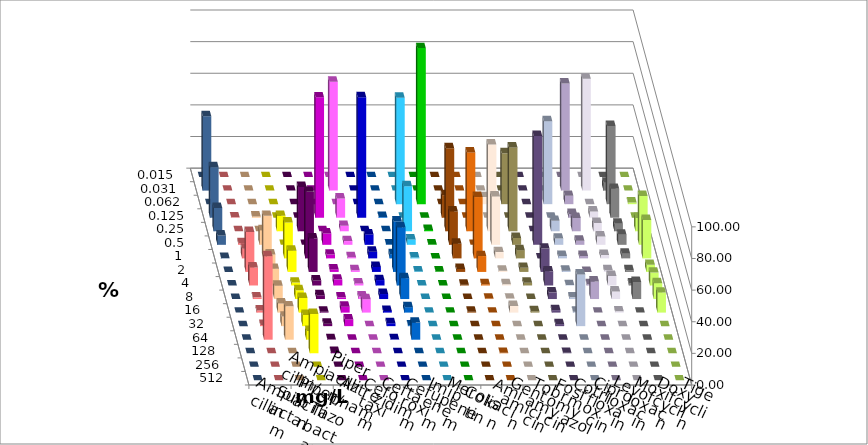
| Category | Ampicillin | Ampicillin/ Sulbactam | Piperacillin | Piperacillin/ Tazobactam | Aztreonam | Cefotaxim | Ceftazidim | Cefuroxim | Imipenem | Meropenem | Colistin | Amikacin | Gentamicin | Tobramycin | Fosfomycin | Cotrimoxazol | Ciprofloxacin | Levofloxacin | Moxifloxacin | Doxycyclin | Tigecyclin |
|---|---|---|---|---|---|---|---|---|---|---|---|---|---|---|---|---|---|---|---|---|---|
| 0.015 | 0 | 0 | 0 | 0 | 0 | 0 | 0 | 0 | 0 | 0 | 0 | 0 | 0 | 0 | 0 | 0 | 0 | 0 | 0 | 0 | 0 |
| 0.031 | 0 | 0 | 0 | 0 | 0 | 68.865 | 0 | 0 | 0 | 0 | 0 | 0 | 0 | 0 | 0 | 0 | 67.81 | 70.712 | 5.026 | 0 | 47.043 |
| 0.062 | 0 | 0 | 0 | 0 | 0 | 0 | 0 | 0 | 67.282 | 98.681 | 0 | 0 | 4.485 | 32.174 | 0 | 52.507 | 5.277 | 0 | 49.471 | 1.055 | 0 |
| 0.125 | 0.264 | 0.792 | 0 | 0 | 76.127 | 12.137 | 76.253 | 0.528 | 0 | 0 | 14.248 | 0 | 0 | 0 | 0 | 0 | 2.375 | 3.958 | 18.254 | 0 | 31.989 |
| 0.25 | 0 | 0 | 9.763 | 28.042 | 0 | 3.43 | 0 | 0 | 28.496 | 0.792 | 52.507 | 49.868 | 54.881 | 53.043 | 0 | 6.596 | 8.443 | 5.277 | 4.762 | 8.443 | 14.785 |
| 0.5 | 1.055 | 9.235 | 0 | 0 | 7.162 | 2.375 | 6.596 | 0.264 | 3.43 | 0.264 | 21.108 | 0 | 30.607 | 4.348 | 68.865 | 3.958 | 2.639 | 5.277 | 6.349 | 30.871 | 5.914 |
| 1.0 | 6.069 | 26.913 | 22.691 | 42.063 | 2.387 | 0.792 | 4.222 | 2.639 | 0.528 | 0 | 9.235 | 38.786 | 3.958 | 5.217 | 0 | 1.583 | 1.583 | 2.111 | 2.91 | 24.274 | 0.269 |
| 2.0 | 25.33 | 11.082 | 13.456 | 21.164 | 1.592 | 1.055 | 3.166 | 31.926 | 0.264 | 0.264 | 1.847 | 10.026 | 0.792 | 2.609 | 14.776 | 0.792 | 0 | 1.055 | 1.058 | 4.485 | 0 |
| 4.0 | 11.346 | 10.554 | 1.847 | 3.175 | 3.714 | 1.319 | 3.43 | 36.675 | 0 | 0 | 0.528 | 0.792 | 0.792 | 1.739 | 8.971 | 0.264 | 0.792 | 6.069 | 1.323 | 8.179 | 0 |
| 8.0 | 1.055 | 8.443 | 5.541 | 2.381 | 1.061 | 1.583 | 3.166 | 13.193 | 0 | 0 | 0 | 0.264 | 0.264 | 0 | 4.222 | 1.055 | 11.082 | 4.749 | 10.847 | 10.026 | 0 |
| 16.0 | 1.319 | 5.805 | 9.235 | 0.529 | 3.714 | 8.443 | 1.055 | 3.43 | 0 | 0 | 0.528 | 0 | 4.222 | 0.87 | 1.583 | 0.528 | 0 | 0.792 | 0 | 12.665 | 0 |
| 32.0 | 0.792 | 6.069 | 7.124 | 1.587 | 4.244 | 0 | 1.847 | 0.528 | 0 | 0 | 0 | 0 | 0 | 0 | 1.319 | 32.718 | 0 | 0 | 0 | 0 | 0 |
| 64.0 | 52.77 | 21.108 | 5.541 | 0.265 | 0 | 0 | 0.264 | 10.818 | 0 | 0 | 0 | 0 | 0 | 0 | 0 | 0 | 0 | 0 | 0 | 0 | 0 |
| 128.0 | 0 | 0 | 24.802 | 0.794 | 0 | 0 | 0 | 0 | 0 | 0 | 0 | 0.264 | 0 | 0 | 0.264 | 0 | 0 | 0 | 0 | 0 | 0 |
| 256.0 | 0 | 0 | 0 | 0 | 0 | 0 | 0 | 0 | 0 | 0 | 0 | 0 | 0 | 0 | 0 | 0 | 0 | 0 | 0 | 0 | 0 |
| 512.0 | 0 | 0 | 0 | 0 | 0 | 0 | 0 | 0 | 0 | 0 | 0 | 0 | 0 | 0 | 0 | 0 | 0 | 0 | 0 | 0 | 0 |